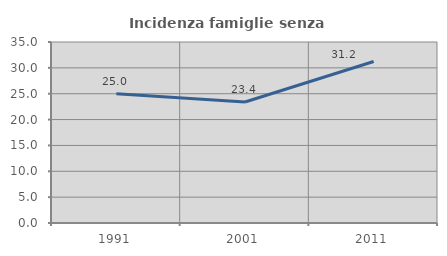
| Category | Incidenza famiglie senza nuclei |
|---|---|
| 1991.0 | 25 |
| 2001.0 | 23.404 |
| 2011.0 | 31.225 |